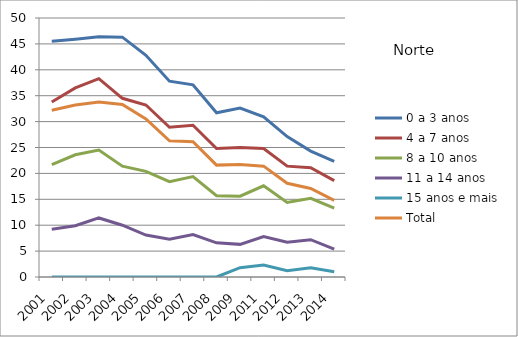
| Category | 0 a 3 anos | 4 a 7 anos | 8 a 10 anos | 11 a 14 anos | 15 anos e mais | Total |
|---|---|---|---|---|---|---|
| 2001.0 | 45.5 | 33.8 | 21.7 | 9.2 | 0 | 32.2 |
| 2002.0 | 45.9 | 36.5 | 23.6 | 9.9 | 0 | 33.2 |
| 2003.0 | 46.4 | 38.3 | 24.5 | 11.4 | 0 | 33.8 |
| 2004.0 | 46.3 | 34.5 | 21.4 | 10 | 0 | 33.3 |
| 2005.0 | 42.8 | 33.2 | 20.4 | 8.1 | 0 | 30.5 |
| 2006.0 | 37.8 | 28.9 | 18.4 | 7.3 | 0 | 26.3 |
| 2007.0 | 37.1 | 29.3 | 19.4 | 8.2 | 0 | 26.1 |
| 2008.0 | 31.7 | 24.8 | 15.7 | 6.6 | 0 | 21.6 |
| 2009.0 | 32.6 | 25 | 15.6 | 6.3 | 1.8 | 21.7 |
| 2011.0 | 30.9 | 24.8 | 17.6 | 7.8 | 2.3 | 21.4 |
| 2012.0 | 27.1 | 21.4 | 14.4 | 6.7 | 1.2 | 18.1 |
| 2013.0 | 24.3 | 21.1 | 15.2 | 7.2 | 1.8 | 17.1 |
| 2014.0 | 22.3 | 18.6 | 13.3 | 5.4 | 1 | 14.8 |